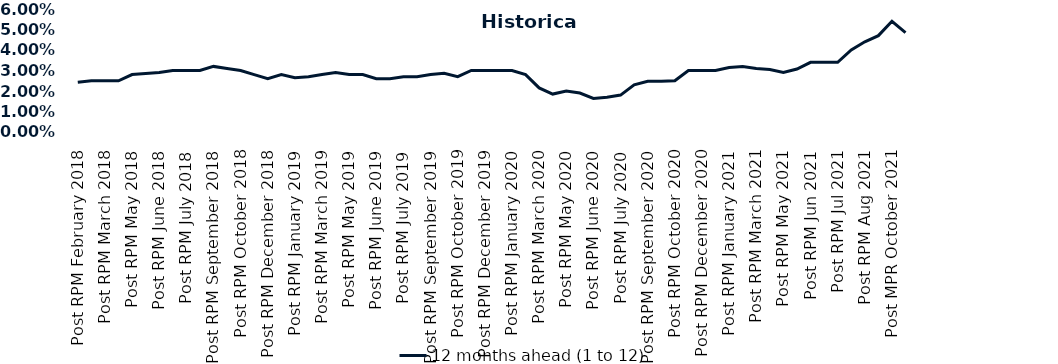
| Category | 12 months ahead (1 to 12)  |
|---|---|
| Post RPM February 2018 | 0.024 |
| Pre RPM March 2018 | 0.025 |
| Post RPM March 2018 | 0.025 |
| Pre RPM May 2018 | 0.025 |
| Post RPM May 2018 | 0.028 |
| Pre RPM June 2018 | 0.028 |
| Post RPM June 2018 | 0.029 |
| Pre RPM July 2018 | 0.03 |
| Post RPM July 2018 | 0.03 |
| Pre RPM September 2018 | 0.03 |
| Post RPM September 2018 | 0.032 |
| Pre RPM October 2018 | 0.031 |
| Post RPM October 2018 | 0.03 |
| Pre RPM December 2018 | 0.028 |
| Post RPM December 2018 | 0.026 |
| Pre RPM January 2019 | 0.028 |
| Post RPM January 2019 | 0.026 |
| Pre RPM March 2019 | 0.027 |
| Post RPM March 2019 | 0.028 |
| Pre RPM May 2019 | 0.029 |
| Post RPM May 2019 | 0.028 |
| Pre RPM June 2019 | 0.028 |
| Post RPM June 2019 | 0.026 |
| Pre RPM July 2019 | 0.026 |
| Post RPM July 2019 | 0.027 |
| Pre RPM September 2019 | 0.027 |
| Post RPM September 2019 | 0.028 |
| Pre RPM October 2019 | 0.029 |
| Post RPM October 2019 | 0.027 |
| Pre RPM December 2019 | 0.03 |
| Post RPM December 2019 | 0.03 |
| Pre RPM January 2020 | 0.03 |
| Post RPM January 2020 | 0.03 |
| Pre RPM March 2020 | 0.028 |
| Post RPM March 2020 | 0.022 |
| Pre RPM May 2020 | 0.018 |
| Post RPM May 2020 | 0.02 |
| Pre RPM June 2020 | 0.019 |
| Post RPM June 2020 | 0.016 |
| Pre RPM July 2020 | 0.017 |
| Post RPM July 2020 | 0.018 |
| Pre RPM September 2020 | 0.023 |
| Post RPM September 2020 | 0.025 |
| Pre RPM October 2020 | 0.025 |
| Post RPM October 2020 | 0.025 |
| Pre RPM December 2020 | 0.03 |
|  Post RPM December 2020 | 0.03 |
| Pre RPM January 2021 | 0.03 |
| Post RPM January 2021 | 0.032 |
|  Pre RPM March 2021 | 0.032 |
|  Post RPM March 2021 | 0.031 |
|  Pre RPM May 2021 | 0.03 |
|  Post RPM May 2021 | 0.029 |
|  Pre RPM Jun 2021 | 0.031 |
|   Post RPM Jun 2021 | 0.034 |
| Pre RPM Jul 2021 | 0.034 |
|  Post RPM Jul 2021 | 0.034 |
| Pre RPM Aug 2021 | 0.04 |
|  Post RPM Aug 2021 | 0.044 |
| Pre MPR October 2021 | 0.047 |
| Post MPR October 2021 | 0.054 |
| Pre MPR December 2021 | 0.048 |